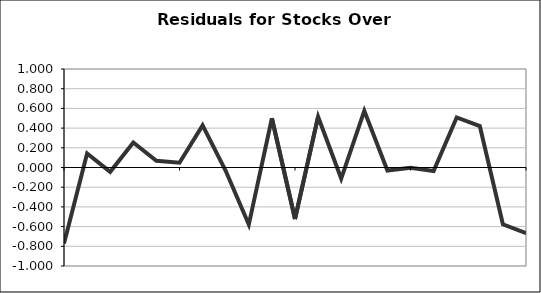
| Category | Series 0 |
|---|---|
| 0 | -0.771 |
| 1 | 0.143 |
| 2 | -0.044 |
| 3 | 0.254 |
| 4 | 0.068 |
| 5 | 0.048 |
| 6 | 0.427 |
| 7 | -0.033 |
| 8 | -0.579 |
| 9 | 0.5 |
| 10 | -0.523 |
| 11 | 0.516 |
| 12 | -0.112 |
| 13 | 0.575 |
| 14 | -0.03 |
| 15 | -0.003 |
| 16 | -0.036 |
| 17 | 0.508 |
| 18 | 0.42 |
| 19 | -0.576 |
| 20 | -0.666 |